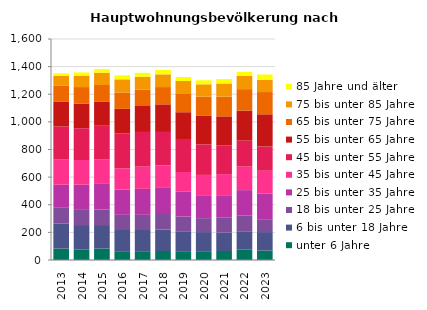
| Category | unter 6 Jahre | 6 bis unter 18 Jahre | 18 bis unter 25 Jahre | 25 bis unter 35 Jahre | 35 bis unter 45 Jahre | 45 bis unter 55 Jahre | 55 bis unter 65 Jahre | 65 bis unter 75 Jahre | 75 bis unter 85 Jahre | 85 Jahre und älter |
|---|---|---|---|---|---|---|---|---|---|---|
| 2013.0 | 83 | 182 | 113 | 167 | 185 | 236 | 182 | 113 | 71 | 20 |
| 2014.0 | 77 | 176 | 110 | 182 | 179 | 230 | 179 | 119 | 83 | 23 |
| 2015.0 | 83 | 170 | 113 | 185 | 176 | 245 | 176 | 119 | 89 | 26 |
| 2016.0 | 59 | 158 | 110 | 182 | 155 | 251 | 179 | 119 | 95 | 29 |
| 2017.0 | 59 | 158 | 110 | 188 | 161 | 251 | 188 | 119 | 92 | 29 |
| 2018.0 | 65 | 155 | 113 | 194 | 158 | 242 | 200 | 125 | 92 | 32 |
| 2019.0 | 59 | 149 | 107 | 179 | 143 | 239 | 194 | 137 | 89 | 29 |
| 2020.0 | 59 | 143 | 101 | 161 | 152 | 221 | 206 | 140 | 89 | 29 |
| 2021.0 | 65 | 134 | 107 | 158 | 158 | 209 | 209 | 143 | 95 | 32 |
| 2022.0 | 77 | 131 | 113 | 185 | 170 | 188 | 218 | 155 | 95 | 29 |
| 2023.0 | 68 | 134 | 89 | 191 | 164 | 176 | 233 | 161 | 89 | 38 |